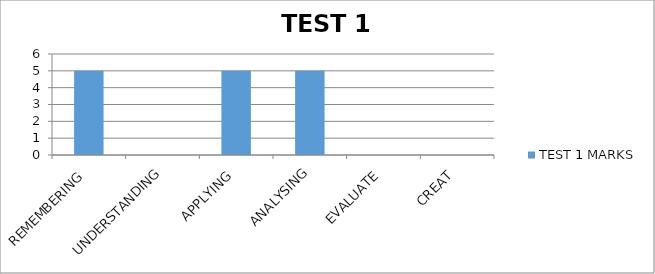
| Category | TEST 1 MARKS |
|---|---|
| REMEMBERING | 5 |
| UNDERSTANDING | 0 |
| APPLYING | 5 |
| ANALYSING | 5 |
| EVALUATE | 0 |
| CREAT | 0 |